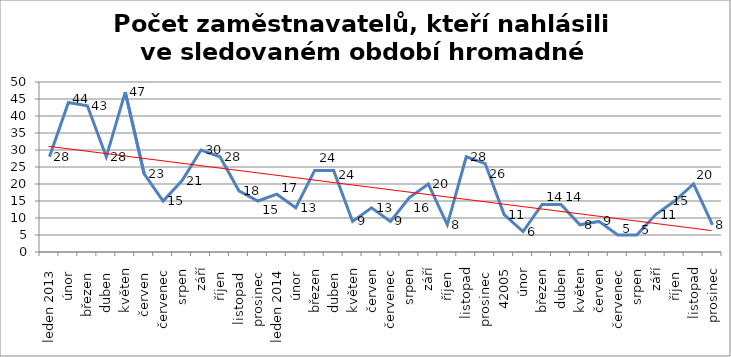
| Category | Series 0 |
|---|---|
|  leden 2013 | 28 |
| únor  | 44 |
| březen  | 43 |
| duben  | 28 |
| květen | 47 |
| červen  | 23 |
| červenec | 15 |
| srpen | 21 |
| září | 30 |
| říjen  | 28 |
| listopad  | 18 |
| prosinec  | 15 |
|  leden 2014 | 17 |
| únor  | 13 |
| březen | 24 |
| duben  | 24 |
| květen | 9 |
| červen | 13 |
| červenec | 9 |
| srpen | 16 |
| září | 20 |
| říjen  | 8 |
| listopad | 28 |
| prosinec  | 26 |
| 42005 | 11 |
| únor | 6 |
| březen | 14 |
| duben | 14 |
| květen | 8 |
| červen | 9 |
| červenec | 5 |
| srpen | 5 |
| září | 11 |
| říjen  | 15 |
| listopad | 20 |
| prosinec | 8 |